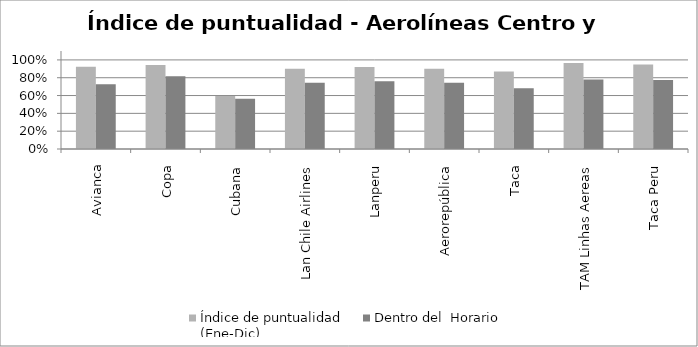
| Category | Índice de puntualidad
(Ene-Dic) | Dentro del  Horario |
|---|---|---|
| Avianca | 0.923 | 0.728 |
| Copa | 0.944 | 0.816 |
| Cubana | 0.595 | 0.564 |
| Lan Chile Airlines | 0.901 | 0.742 |
| Lanperu | 0.919 | 0.76 |
| Aerorepública | 0.9 | 0.745 |
| Taca | 0.87 | 0.681 |
| TAM Linhas Aereas | 0.964 | 0.781 |
| Taca Peru | 0.949 | 0.774 |